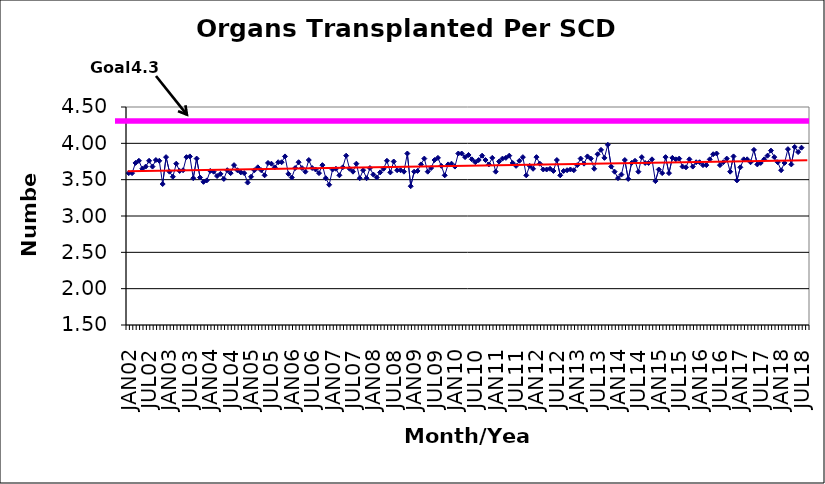
| Category | Series 0 |
|---|---|
| JAN02 | 3.59 |
| FEB02 | 3.59 |
| MAR02 | 3.73 |
| APR02 | 3.76 |
| MAY02 | 3.65 |
| JUN02 | 3.68 |
| JUL02 | 3.76 |
| AUG02 | 3.68 |
| SEP02 | 3.77 |
| OCT02 | 3.76 |
| NOV02 | 3.44 |
| DEC02 | 3.81 |
| JAN03 | 3.61 |
| FEB03 | 3.54 |
| MAR03 | 3.72 |
| APR03 | 3.62 |
| MAY03 | 3.63 |
| JUN03 | 3.81 |
| JUL03 | 3.82 |
| AUG03 | 3.52 |
| SEP03 | 3.79 |
| OCT03 | 3.53 |
| NOV03 | 3.47 |
| DEC03 | 3.49 |
| JAN04 | 3.62 |
| FEB04 | 3.61 |
| MAR04 | 3.55 |
| APR04 | 3.58 |
| MAY04 | 3.51 |
| JUN04 | 3.63 |
| JUL04 | 3.59 |
| AUG04 | 3.7 |
| SEP04 | 3.63 |
| OCT04 | 3.6 |
| NOV04 | 3.59 |
| DEC04 | 3.46 |
| JAN05 | 3.54 |
| FEB05 | 3.63 |
| MAR05 | 3.67 |
| APR05 | 3.63 |
| MAY05 | 3.56 |
| JUN05 | 3.73 |
| JUL05 | 3.72 |
| AUG05 | 3.67 |
| SEP05 | 3.74 |
| OCT05 | 3.74 |
| NOV05 | 3.82 |
| DEC05 | 3.58 |
| JAN06 | 3.53 |
| FEB06 | 3.66 |
| MAR06 | 3.74 |
| APR06 | 3.66 |
| MAY06 | 3.61 |
| JUN06 | 3.77 |
| JUL06 | 3.66 |
| AUG06 | 3.64 |
| SEP06 | 3.59 |
| OCT06 | 3.7 |
| NOV06 | 3.52 |
| DEC06 | 3.43 |
| JAN07 | 3.64 |
| FEB07 | 3.65 |
| MAR07 | 3.56 |
| APR07 | 3.67 |
| MAY07 | 3.83 |
| JUN07 | 3.65 |
| JUL07 | 3.61 |
| AUG07 | 3.72 |
| SEP07 | 3.52 |
| OCT07 | 3.63 |
| NOV07 | 3.52 |
| DEC07 | 3.66 |
| JAN08 | 3.57 |
| FEB08 | 3.53 |
| MAR08 | 3.6 |
| APR08 | 3.65 |
| MAY08 | 3.76 |
| JUN08 | 3.6 |
| JUL08 | 3.75 |
| AUG08 | 3.63 |
| SEP08 | 3.63 |
| OCT08 | 3.61 |
| NOV08 | 3.86 |
| DEC08 | 3.41 |
| JAN09 | 3.61 |
| FEB09 | 3.62 |
| MAR09 | 3.71 |
| APR09 | 3.79 |
| MAY09 | 3.61 |
| JUN09 | 3.66 |
| JUL09 | 3.77 |
| AUG09 | 3.8 |
| SEP09 | 3.69 |
| OCT09 | 3.56 |
| NOV09 | 3.71 |
| DEC09 | 3.72 |
| JAN10 | 3.68 |
| FEB10 | 3.86 |
| MAR10 | 3.86 |
| APR10 | 3.81 |
| MAY10 | 3.84 |
| JUN10 | 3.78 |
| JUL10 | 3.74 |
| AUG10 | 3.77 |
| SEP10 | 3.83 |
| OCT10 | 3.77 |
| NOV10 | 3.71 |
| DEC10 | 3.8 |
| JAN11 | 3.61 |
| FEB11 | 3.75 |
| MAR11 | 3.79 |
| APR11 | 3.8 |
| MAY11 | 3.83 |
| JUN11 | 3.73 |
| JUL11 | 3.69 |
| AUG11 | 3.76 |
| SEP11 | 3.81 |
| OCT11 | 3.56 |
| NOV11 | 3.69 |
| DEC11 | 3.65 |
| JAN12 | 3.81 |
| FEB12 | 3.72 |
| MAR12 | 3.64 |
| APR12 | 3.64 |
| MAY12 | 3.65 |
| JUN12 | 3.62 |
| JUL12 | 3.77 |
| AUG12 | 3.56 |
| SEP12 | 3.62 |
| OCT12 | 3.63 |
| NOV12 | 3.64 |
| DEC12 | 3.63 |
| JAN13 | 3.7 |
| FEB13 | 3.79 |
| MAR13 | 3.72 |
| APR13 | 3.82 |
| MAY13 | 3.79 |
| JUN13 | 3.65 |
| JUL13 | 3.85 |
| AUG13 | 3.91 |
| SEP13 | 3.8 |
| OCT13 | 3.98 |
| NOV13 | 3.68 |
| DEC13 | 3.61 |
| JAN14 | 3.52 |
| FEB14 | 3.57 |
| MAR14 | 3.77 |
| APR14 | 3.51 |
| MAY14 | 3.73 |
| JUN14 | 3.76 |
| JUL14 | 3.61 |
| AUG14 | 3.81 |
| SEP14 | 3.73 |
| OCT14 | 3.73 |
| NOV14 | 3.78 |
| DEC14 | 3.48 |
| JAN15 | 3.64 |
| FEB15 | 3.59 |
| MAR15 | 3.81 |
| APR15 | 3.59 |
| MAY15 | 3.8 |
| JUN15 | 3.78 |
| JUL15 | 3.79 |
| AUG15 | 3.68 |
| SEP15 | 3.67 |
| OCT15 | 3.78 |
| NOV15 | 3.68 |
| DEC15 | 3.74 |
| JAN16 | 3.74 |
| FEB16 | 3.7 |
| MAR16 | 3.7 |
| APR16 | 3.78 |
| MAY16 | 3.85 |
| JUN16 | 3.86 |
| JUL16 | 3.7 |
| AUG16 | 3.74 |
| SEP16 | 3.79 |
| OCT16 | 3.61 |
| NOV16 | 3.82 |
| DEC16 | 3.49 |
| JAN17 | 3.67 |
| FEB17 | 3.78 |
| MAR17 | 3.78 |
| APR17 | 3.74 |
| MAY17 | 3.91 |
| JUN17 | 3.71 |
| JUL17 | 3.73 |
| AUG17 | 3.78 |
| SEP17 | 3.83 |
| OCT17 | 3.9 |
| NOV17 | 3.81 |
| DEC17 | 3.74 |
| JAN18 | 3.63 |
| FEB18 | 3.73 |
| MAR18 | 3.92 |
| APR18 | 3.71 |
| MAY18 | 3.95 |
| JUN18 | 3.88 |
| JUL18 | 3.94 |